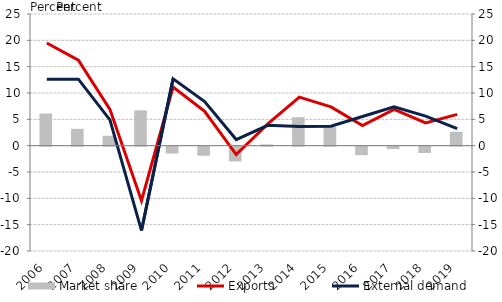
| Category | Market share |
|---|---|
| 2006.0 | 6.105 |
| 2007.0 | 3.196 |
| 2008.0 | 1.885 |
| 2009.0 | 6.713 |
| 2010.0 | -1.308 |
| 2011.0 | -1.728 |
| 2012.0 | -2.817 |
| 2013.0 | 0.241 |
| 2014.0 | 5.407 |
| 2015.0 | 3.529 |
| 2016.0 | -1.605 |
| 2017.0 | -0.463 |
| 2018.0 | -1.203 |
| 2019.0 | 2.629 |